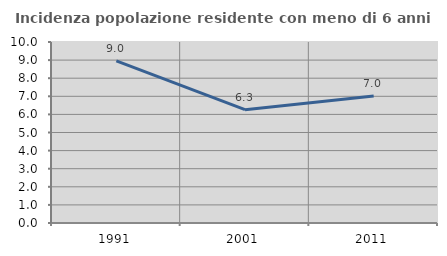
| Category | Incidenza popolazione residente con meno di 6 anni |
|---|---|
| 1991.0 | 8.952 |
| 2001.0 | 6.26 |
| 2011.0 | 7.02 |